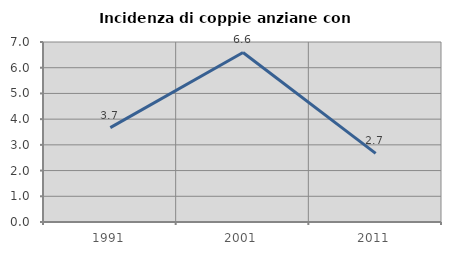
| Category | Incidenza di coppie anziane con figli |
|---|---|
| 1991.0 | 3.67 |
| 2001.0 | 6.593 |
| 2011.0 | 2.667 |